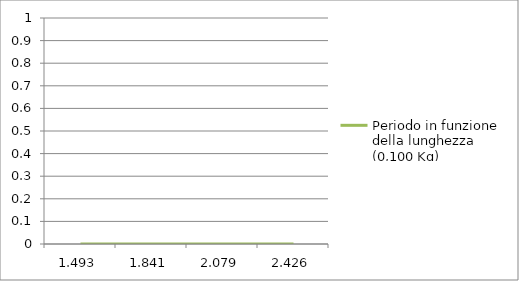
| Category | Periodo in funzione della lunghezza (0,100 Kg) |
|---|---|
| 1.493 | 0 |
| 1.841 | 0 |
| 2.079 | 0 |
| 2.426 | 0 |